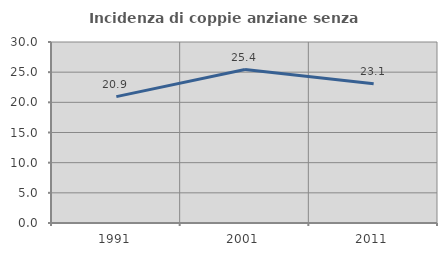
| Category | Incidenza di coppie anziane senza figli  |
|---|---|
| 1991.0 | 20.942 |
| 2001.0 | 25.442 |
| 2011.0 | 23.093 |